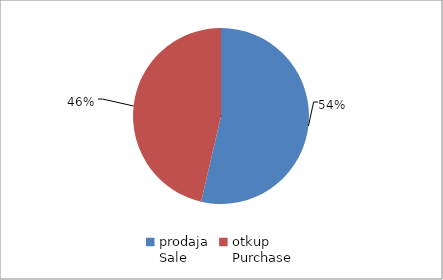
| Category | Series 0 |
|---|---|
| prodaja
Sale | 141470487.071 |
| otkup
Purchase | 122313592.92 |